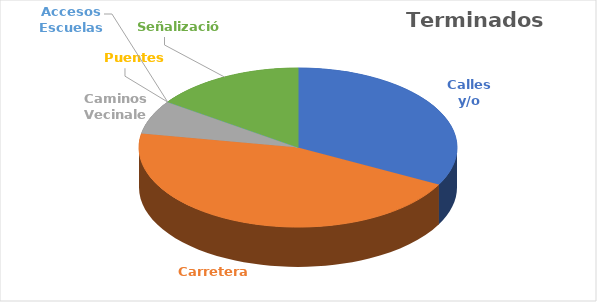
| Category | Terminados (kms) |
|---|---|
| Calles y/o Avenidas | 179.25 |
| Carreteras | 247.16 |
| Caminos Vecinales | 37.64 |
| Puentes  | 0 |
| Accesos Escuelas | 0 |
| Señalización | 83.8 |